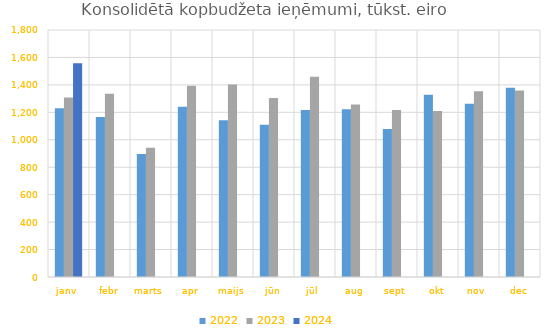
| Category | 2022 | 2023 | 2024 |
|---|---|---|---|
| janv | 1230170.047 | 1307495.685 | 1557359.802 |
| febr | 1166379.907 | 1335076.73 | 0 |
| marts | 896198.796 | 941933.145 | 0 |
| apr | 1240480.294 | 1392983.428 | 0 |
| maijs | 1141583.555 | 1402498.183 | 0 |
| jūn | 1110073.881 | 1304045.598 | 0 |
| jūl | 1217508.617 | 1459749.866 | 0 |
| aug | 1222030.584 | 1257876.494 | 0 |
| sept | 1079167.695 | 1217869.498 | 0 |
| okt | 1328712.607 | 1209805.903 | 0 |
| nov | 1261934.438 | 1354090.244 | 0 |
| dec | 1379607.658 | 1358321.803 | 0 |